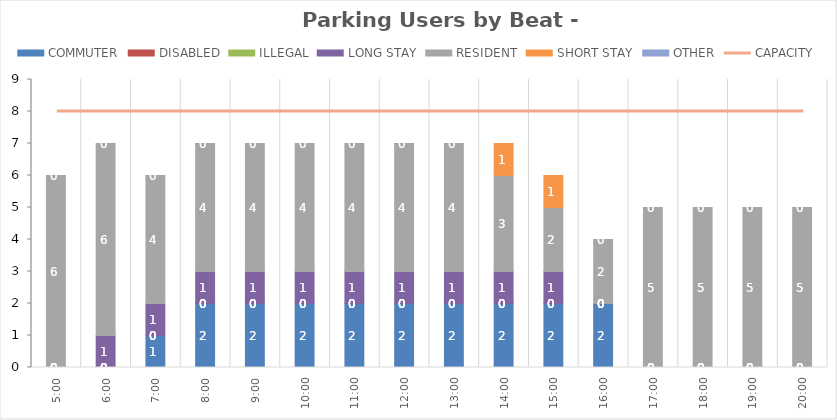
| Category | COMMUTER | DISABLED | ILLEGAL | LONG STAY | RESIDENT | SHORT STAY | OTHER |
|---|---|---|---|---|---|---|---|
| 0.20833333333333334 | 0 | 0 | 0 | 0 | 6 | 0 | 0 |
| 0.25 | 0 | 0 | 0 | 1 | 6 | 0 | 0 |
| 0.2916666666666667 | 1 | 0 | 0 | 1 | 4 | 0 | 0 |
| 0.3333333333333333 | 2 | 0 | 0 | 1 | 4 | 0 | 0 |
| 0.375 | 2 | 0 | 0 | 1 | 4 | 0 | 0 |
| 0.4166666666666667 | 2 | 0 | 0 | 1 | 4 | 0 | 0 |
| 0.4583333333333333 | 2 | 0 | 0 | 1 | 4 | 0 | 0 |
| 0.5 | 2 | 0 | 0 | 1 | 4 | 0 | 0 |
| 0.5416666666666666 | 2 | 0 | 0 | 1 | 4 | 0 | 0 |
| 0.5833333333333334 | 2 | 0 | 0 | 1 | 3 | 1 | 0 |
| 0.625 | 2 | 0 | 0 | 1 | 2 | 1 | 0 |
| 0.6666666666666666 | 2 | 0 | 0 | 0 | 2 | 0 | 0 |
| 0.7083333333333334 | 0 | 0 | 0 | 0 | 5 | 0 | 0 |
| 0.75 | 0 | 0 | 0 | 0 | 5 | 0 | 0 |
| 0.7916666666666666 | 0 | 0 | 0 | 0 | 5 | 0 | 0 |
| 0.8333333333333334 | 0 | 0 | 0 | 0 | 5 | 0 | 0 |